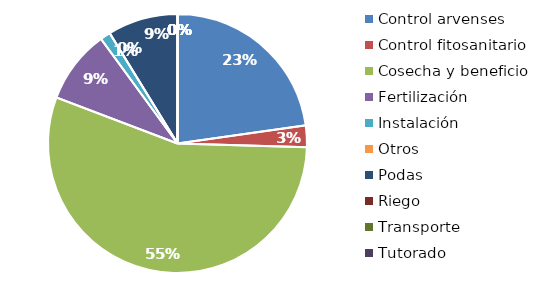
| Category | Valor |
|---|---|
| Control arvenses | 14120000 |
| Control fitosanitario | 1680000 |
| Cosecha y beneficio | 34320000 |
| Fertilización | 5680000 |
| Instalación | 800000 |
| Otros | 0 |
| Podas | 5440000 |
| Riego | 0 |
| Transporte | 0 |
| Tutorado | 0 |